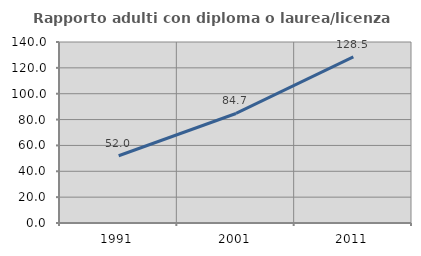
| Category | Rapporto adulti con diploma o laurea/licenza media  |
|---|---|
| 1991.0 | 52.043 |
| 2001.0 | 84.72 |
| 2011.0 | 128.512 |